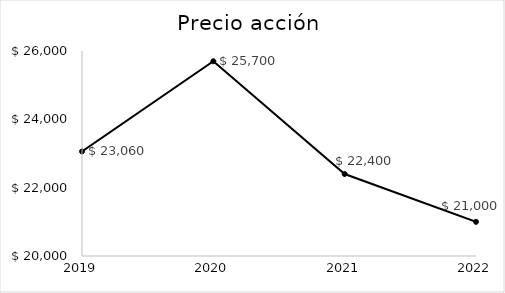
| Category | Precio acción |
|---|---|
| 2019.0 | 23060 |
| 2020.0 | 25700 |
| 2021.0 | 22400 |
| 2022.0 | 21000 |